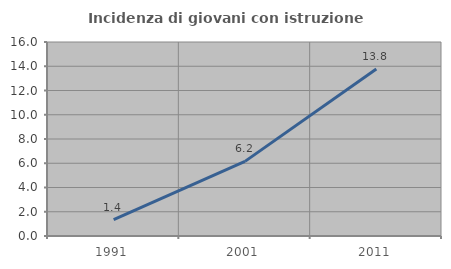
| Category | Incidenza di giovani con istruzione universitaria |
|---|---|
| 1991.0 | 1.361 |
| 2001.0 | 6.154 |
| 2011.0 | 13.772 |